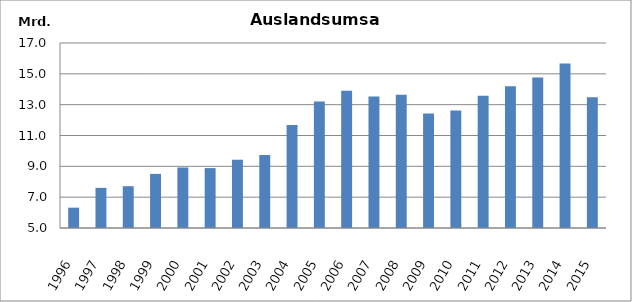
| Category | darunter
Auslandsumsatz |
|---|---|
| 1996.0 | 6319142 |
| 1997.0 | 7603819 |
| 1998.0 | 7711587 |
| 1999.0 | 8508603 |
| 2000.0 | 8925754 |
| 2001.0 | 8885463 |
| 2002.0 | 9428713 |
| 2003.0 | 9733339 |
| 2004.0 | 11680546 |
| 2005.0 | 13208153 |
| 2006.0 | 13901521 |
| 2007.0 | 13537187 |
| 2008.0 | 13649884 |
| 2009.0 | 12432618 |
| 2010.0 | 12628416.402 |
| 2011.0 | 13577795 |
| 2012.0 | 14199097.02 |
| 2013.0 | 14765099.402 |
| 2014.0 | 15677925.464 |
| 2015.0 | 13486756 |